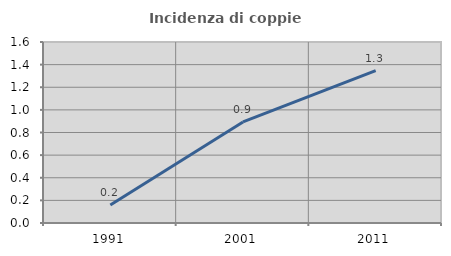
| Category | Incidenza di coppie miste |
|---|---|
| 1991.0 | 0.158 |
| 2001.0 | 0.894 |
| 2011.0 | 1.348 |